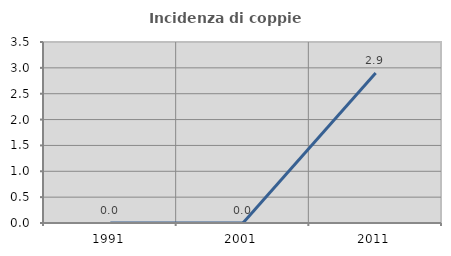
| Category | Incidenza di coppie miste |
|---|---|
| 1991.0 | 0 |
| 2001.0 | 0 |
| 2011.0 | 2.899 |